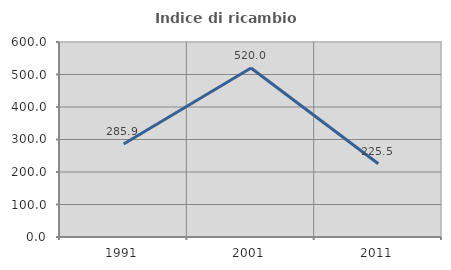
| Category | Indice di ricambio occupazionale  |
|---|---|
| 1991.0 | 285.897 |
| 2001.0 | 520 |
| 2011.0 | 225.523 |